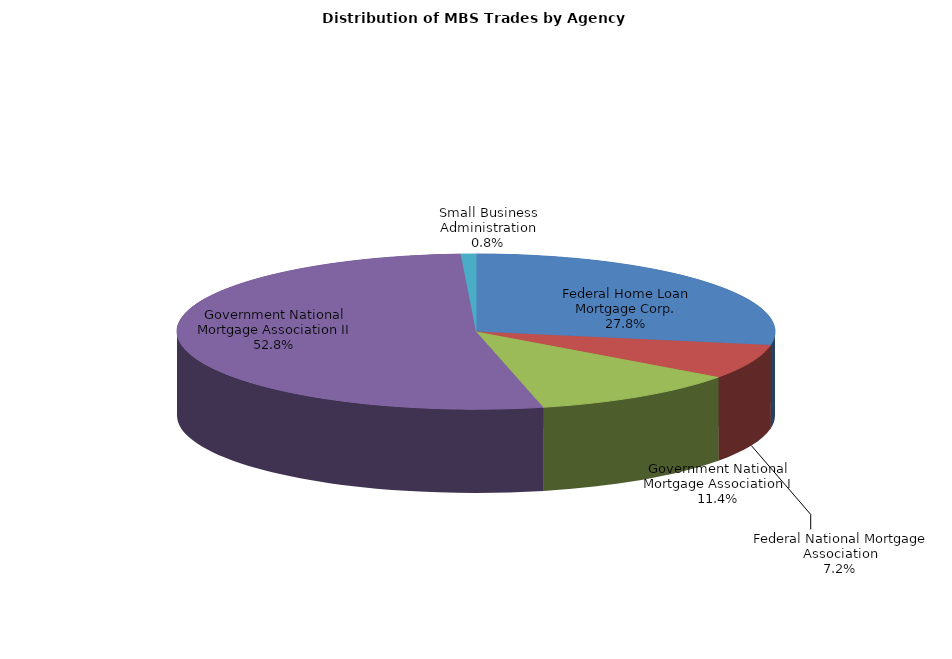
| Category | Series 0 |
|---|---|
| Federal Home Loan Mortgage Corp. | 351.199 |
| Federal National Mortgage Association | 90.9 |
| Government National Mortgage Association I | 144.538 |
| Government National Mortgage Association II | 667.506 |
| Small Business Administration | 10.355 |